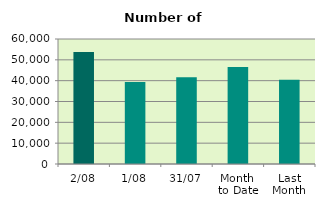
| Category | Series 0 |
|---|---|
| 2/08 | 53714 |
| 1/08 | 39398 |
| 31/07 | 41602 |
| Month 
to Date | 46556 |
| Last
Month | 40410.857 |